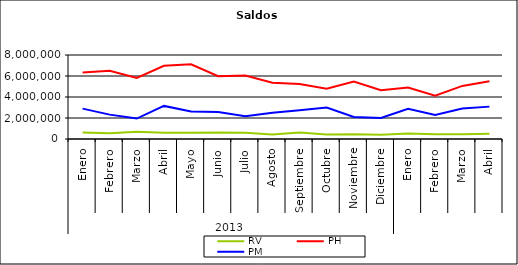
| Category | RV | PH | PM |
|---|---|---|---|
| 0 | 625726.624 | 6338490.057 | 2894951.851 |
| 1 | 552164.14 | 6505711.807 | 2320902.81 |
| 2 | 684317.675 | 5822855.149 | 1948127.804 |
| 3 | 601474.166 | 6976391.987 | 3151453.143 |
| 4 | 590050.657 | 7107878.906 | 2620515.735 |
| 5 | 624993.58 | 5975534.656 | 2574055.31 |
| 6 | 600696.535 | 6050025.472 | 2173848.831 |
| 7 | 419012.816 | 5367684.924 | 2503871.717 |
| 8 | 611730.758 | 5247250.768 | 2727549.288 |
| 9 | 419155.215 | 4784420.625 | 2990459.774 |
| 10 | 447319.577 | 5481772.72 | 2092491.866 |
| 11 | 408611.698 | 4646492.747 | 1999878.157 |
| 12 | 527889.485 | 4912075.273 | 2877652.76 |
| 13 | 454567.098 | 4120538.063 | 2278357.683 |
| 14 | 451499.2 | 5057360.029 | 2895505.472 |
| 15 | 496328.639 | 5498657.25 | 3083378.882 |